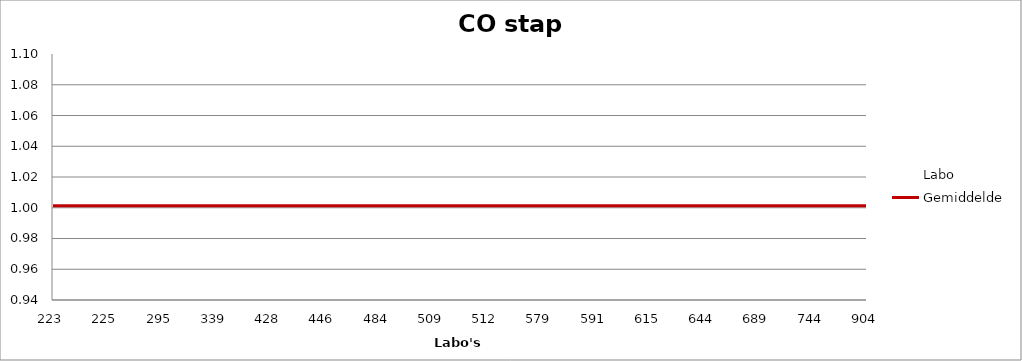
| Category | Labo | Gemiddelde |
|---|---|---|
| 223.0 | 0.986 | 1.001 |
| 225.0 | 1.006 | 1.001 |
| 295.0 | 0.973 | 1.001 |
| 339.0 | 1.04 | 1.001 |
| 428.0 | 1.006 | 1.001 |
| 446.0 | 0.999 | 1.001 |
| 484.0 | 0.993 | 1.001 |
| 509.0 | 1.026 | 1.001 |
| 512.0 | 0.959 | 1.001 |
| 579.0 | 1.04 | 1.001 |
| 591.0 | 0.966 | 1.001 |
| 615.0 | 0.973 | 1.001 |
| 644.0 | 1.1 | 1.001 |
| 689.0 | 0.999 | 1.001 |
| 744.0 | 1.006 | 1.001 |
| 904.0 | 1.006 | 1.001 |